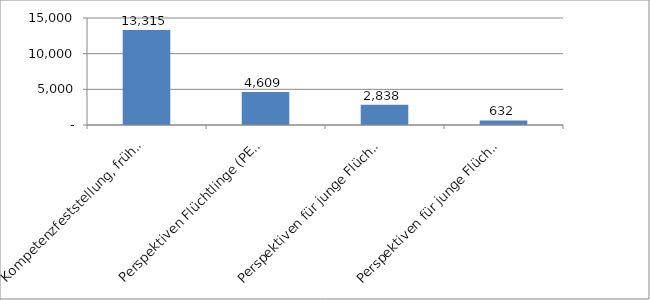
| Category | Series 0 |
|---|---|
| Kompetenzfeststellung, frühzeitige Aktivierung und Spracherwerb (KOMPAS) | 13315 |
| Perspektiven Flüchtlinge (PERF) | 4609 |
| Perspektiven für junge Flüchtlinge (PERJUF) | 2838 |
| Perspektiven für junge Flüchtlinge im Handwerk (PERJUF-H) | 632 |